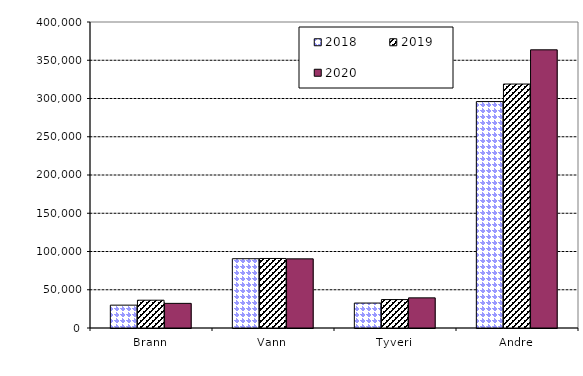
| Category | 2018 | 2019 | 2020 |
|---|---|---|---|
| Brann | 29861.201 | 36333.151 | 32197.085 |
| Vann | 90583.531 | 90885.235 | 90395.745 |
| Tyveri | 32604.24 | 37173.079 | 39406.155 |
| Andre | 295967.064 | 318893.277 | 363630.106 |